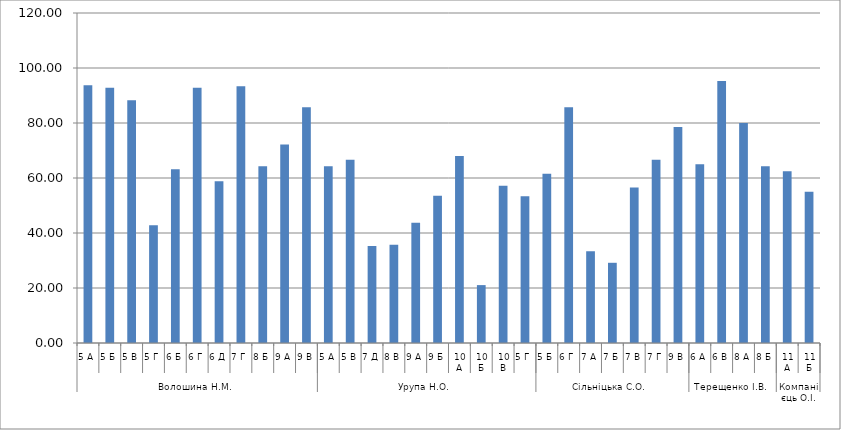
| Category | Series 0 |
|---|---|
| 0 | 93.75 |
| 1 | 92.857 |
| 2 | 88.235 |
| 3 | 42.857 |
| 4 | 63.158 |
| 5 | 92.857 |
| 6 | 58.824 |
| 7 | 93.333 |
| 8 | 64.286 |
| 9 | 72.222 |
| 10 | 85.714 |
| 11 | 64.286 |
| 12 | 66.667 |
| 13 | 35.294 |
| 14 | 35.714 |
| 15 | 43.75 |
| 16 | 53.571 |
| 17 | 68 |
| 18 | 21.053 |
| 19 | 57.143 |
| 20 | 53.333 |
| 21 | 61.538 |
| 22 | 85.714 |
| 23 | 33.333 |
| 24 | 29.167 |
| 25 | 56.522 |
| 26 | 66.667 |
| 27 | 78.571 |
| 28 | 65 |
| 29 | 95.238 |
| 30 | 80 |
| 31 | 64.286 |
| 32 | 62.5 |
| 33 | 55 |